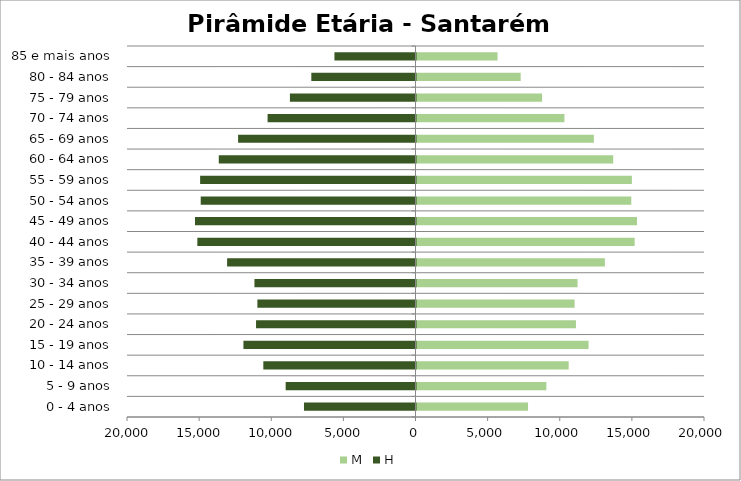
| Category | M | H |
|---|---|---|
| 0 - 4 anos | 7731 | -7731 |
| 5 - 9 anos | 9002 | -9002 |
| 10 - 14 anos | 10550 | -10550 |
| 15 - 19 anos | 11929 | -11929 |
| 20 - 24 anos | 11054 | -11054 |
| 25 - 29 anos | 10961 | -10961 |
| 30 - 34 anos | 11165 | -11165 |
| 35 - 39 anos | 13060 | -13060 |
| 40 - 44 anos | 15124 | -15124 |
| 45 - 49 anos | 15286 | -15286 |
| 50 - 54 anos | 14890 | -14890 |
| 55 - 59 anos | 14931 | -14931 |
| 60 - 64 anos | 13637 | -13637 |
| 65 - 69 anos | 12298 | -12298 |
| 70 - 74 anos | 10254 | -10254 |
| 75 - 79 anos | 8706 | -8706 |
| 80 - 84 anos | 7223 | -7223 |
| 85 e mais anos | 5619 | -5619 |